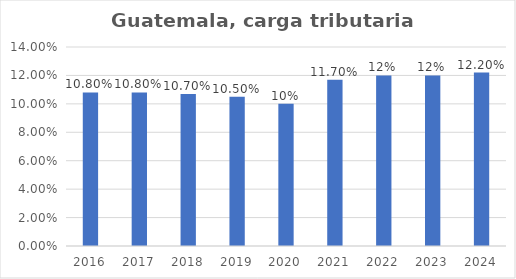
| Category | Carga tributaria |
|---|---|
| 2016.0 | 0.108 |
| 2017.0 | 0.108 |
| 2018.0 | 0.107 |
| 2019.0 | 0.105 |
| 2020.0 | 0.1 |
| 2021.0 | 0.117 |
| 2022.0 | 0.12 |
| 2023.0 | 0.12 |
| 2024.0 | 0.122 |